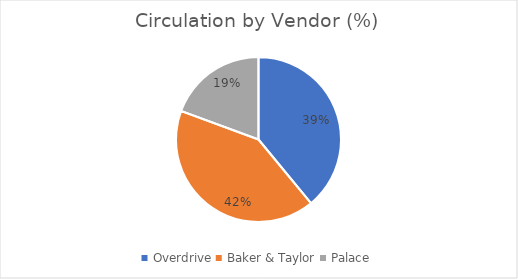
| Category | % |
|---|---|
| Overdrive | 0.39 |
| Baker & Taylor | 0.416 |
| Palace | 0.194 |